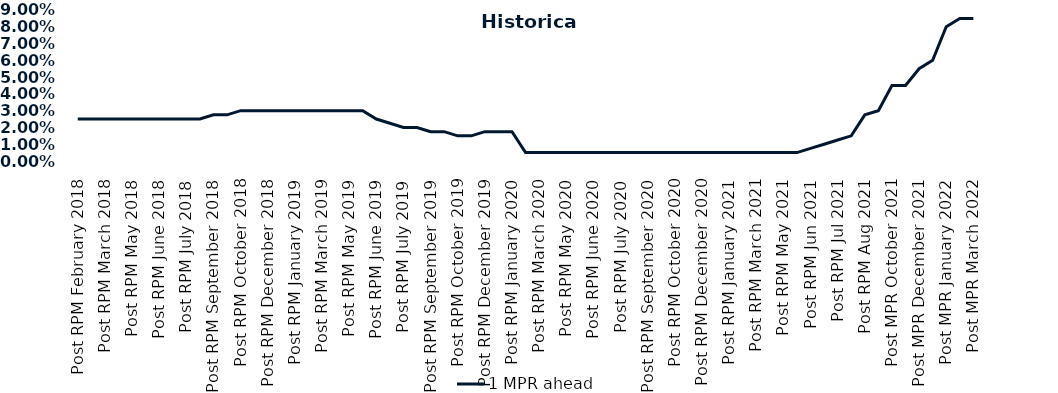
| Category | 1 MPR ahead |
|---|---|
| Post RPM February 2018 | 0.025 |
| Pre RPM March 2018 | 0.025 |
| Post RPM March 2018 | 0.025 |
| Pre RPM May 2018 | 0.025 |
| Post RPM May 2018 | 0.025 |
| Pre RPM June 2018 | 0.025 |
| Post RPM June 2018 | 0.025 |
| Pre RPM July 2018 | 0.025 |
| Post RPM July 2018 | 0.025 |
| Pre RPM September 2018 | 0.025 |
| Post RPM September 2018 | 0.028 |
| Pre RPM October 2018 | 0.028 |
| Post RPM October 2018 | 0.03 |
| Pre RPM December 2018 | 0.03 |
| Post RPM December 2018 | 0.03 |
| Pre RPM January 2019 | 0.03 |
| Post RPM January 2019 | 0.03 |
| Pre RPM March 2019 | 0.03 |
| Post RPM March 2019 | 0.03 |
| Pre RPM May 2019 | 0.03 |
| Post RPM May 2019 | 0.03 |
| Pre RPM June 2019 | 0.03 |
| Post RPM June 2019 | 0.025 |
| Pre RPM July 2019 | 0.022 |
| Post RPM July 2019 | 0.02 |
| Pre RPM September 2019 | 0.02 |
| Post RPM September 2019 | 0.018 |
| Pre RPM October 2019 | 0.018 |
| Post RPM October 2019 | 0.015 |
| Pre RPM December 2019 | 0.015 |
| Post RPM December 2019 | 0.018 |
| Pre RPM January 2020 | 0.018 |
| Post RPM January 2020 | 0.018 |
| Pre RPM March 2020 | 0.005 |
| Post RPM March 2020 | 0.005 |
| Pre RPM May 2020 | 0.005 |
| Post RPM May 2020 | 0.005 |
| Pre RPM June 2020 | 0.005 |
| Post RPM June 2020 | 0.005 |
| Pre RPM July 2020 | 0.005 |
| Post RPM July 2020 | 0.005 |
| Pre RPM September 2020 | 0.005 |
| Post RPM September 2020 | 0.005 |
| Pre RPM October 2020 | 0.005 |
| Post RPM October 2020 | 0.005 |
| Pre RPM December 2020 | 0.005 |
|  Post RPM December 2020 | 0.005 |
| Pre RPM January 2021 | 0.005 |
| Post RPM January 2021 | 0.005 |
|  Pre RPM March 2021 | 0.005 |
|  Post RPM March 2021 | 0.005 |
|  Pre RPM May 2021 | 0.005 |
|  Post RPM May 2021 | 0.005 |
|  Pre RPM Jun 2021 | 0.005 |
|   Post RPM Jun 2021 | 0.008 |
| Pre RPM Jul 2021 | 0.01 |
|  Post RPM Jul 2021 | 0.012 |
| Pre RPM Aug 2021 | 0.015 |
|  Post RPM Aug 2021 | 0.028 |
| Pre MPR October 2021 | 0.03 |
| Post MPR October 2021 | 0.045 |
| Pre MPR December 2021 | 0.045 |
| Post MPR December 2021 | 0.055 |
| Pre MPR January 2022 | 0.06 |
| Post MPR January 2022 | 0.08 |
| Pre MPR March 2022 | 0.085 |
| Post MPR March 2022 | 0.085 |